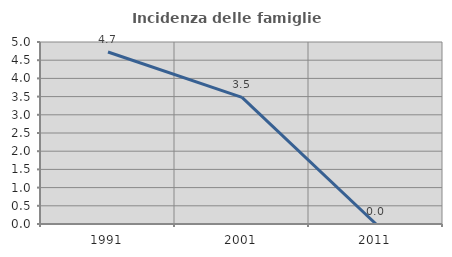
| Category | Incidenza delle famiglie numerose |
|---|---|
| 1991.0 | 4.724 |
| 2001.0 | 3.478 |
| 2011.0 | 0 |